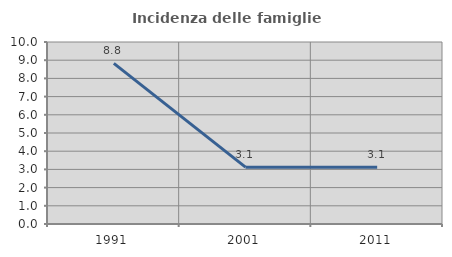
| Category | Incidenza delle famiglie numerose |
|---|---|
| 1991.0 | 8.824 |
| 2001.0 | 3.125 |
| 2011.0 | 3.125 |